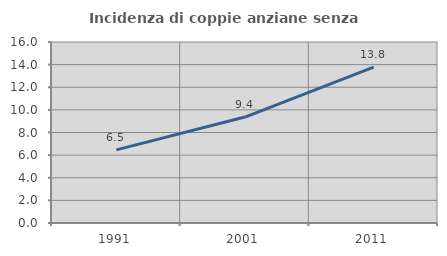
| Category | Incidenza di coppie anziane senza figli  |
|---|---|
| 1991.0 | 6.464 |
| 2001.0 | 9.368 |
| 2011.0 | 13.773 |